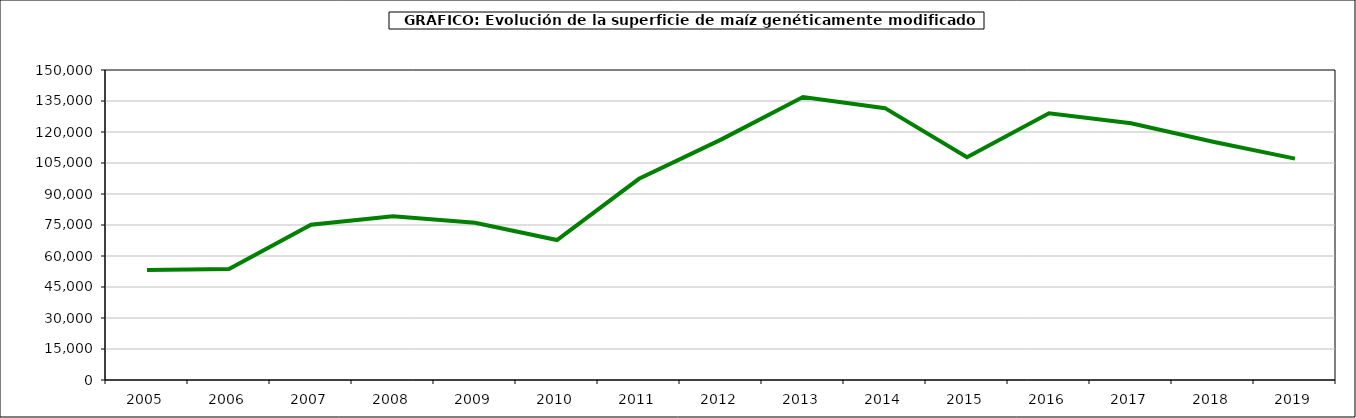
| Category | maiz |
|---|---|
| 2005 | 53226 |
| 2006 | 53667 |
| 2007 | 75148 |
| 2008 | 79269 |
| 2009 | 76057 |
| 2010 | 67726 |
| 2011 | 97346.31 |
| 2012 | 116306.6 |
| 2013 | 136962 |
| 2014 | 131537.67 |
| 2015 | 107749.22 |
| 2016 | 129081.12 |
| 2017 | 124226.87 |
| 2018 | 115246.02 |
| 2019 | 107126.9 |